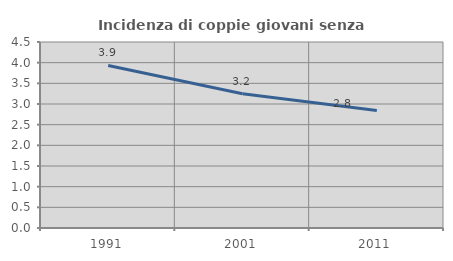
| Category | Incidenza di coppie giovani senza figli |
|---|---|
| 1991.0 | 3.933 |
| 2001.0 | 3.249 |
| 2011.0 | 2.845 |